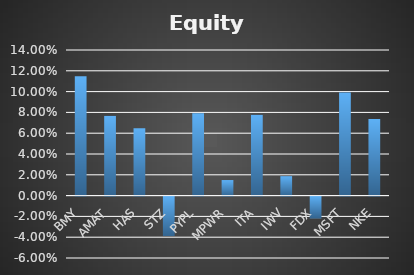
| Category | Series 0 |
|---|---|
| BMY | 0.115 |
| AMAT | 0.077 |
| HAS | 0.065 |
| STZ | -0.038 |
| PYPL | 0.079 |
| MPWR | 0.015 |
| ITA | 0.078 |
| IWV | 0.019 |
| FDX | -0.021 |
| MSFT | 0.099 |
| NKE | 0.074 |